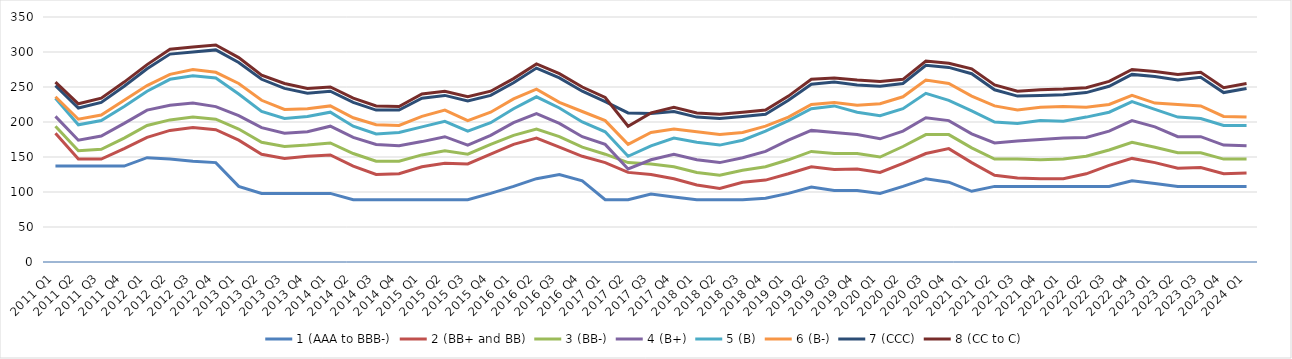
| Category | 1 (AAA to BBB-) | 2 (BB+ and BB) | 3 (BB-) | 4 (B+) | 5 (B) | 6 (B-) | 7 (CCC) | 8 (CC to C) |
|---|---|---|---|---|---|---|---|---|
| 2011 Q1 | 137 | 184 | 194 | 208 | 234 | 236 | 252 | 257 |
| 2011 Q2 | 137 | 147 | 159 | 174 | 196 | 204 | 220 | 226 |
| 2011 Q3 | 137 | 147 | 161 | 180 | 202 | 210 | 228 | 234 |
| 2011 Q4 | 137 | 162 | 177 | 198 | 222 | 231 | 251 | 257 |
| 2012 Q1 | 149 | 178 | 195 | 217 | 244 | 252 | 276 | 282 |
| 2012 Q2 | 147 | 188 | 203 | 224 | 261 | 268 | 297 | 304 |
| 2012 Q3 | 144 | 192 | 207 | 227 | 266 | 275 | 300 | 307 |
| 2012 Q4 | 142 | 189 | 204 | 222 | 263 | 271 | 303 | 310 |
| 2013 Q1 | 108 | 174 | 190 | 209 | 240 | 255 | 285 | 292 |
| 2013 Q2 | 98 | 154 | 171 | 192 | 215 | 231 | 261 | 267 |
| 2013 Q3 | 98 | 148 | 165 | 184 | 205 | 218 | 248 | 255 |
| 2013 Q4 | 98 | 151 | 167 | 186 | 208 | 219 | 241 | 248 |
| 2014 Q1 | 98 | 153 | 170 | 194 | 214 | 223 | 244 | 250 |
| 2014 Q2 | 89 | 137 | 155 | 178 | 194 | 206 | 228 | 234 |
| 2014 Q3 | 89 | 125 | 144 | 168 | 183 | 196 | 217 | 223 |
| 2014 Q4 | 89 | 126 | 144 | 166 | 185 | 195 | 217 | 222 |
| 2015 Q1 | 89 | 136 | 153 | 172 | 193 | 208 | 234 | 240 |
| 2015 Q2 | 89 | 141 | 159 | 179 | 201 | 217 | 238 | 244 |
| 2015 Q3 | 89 | 140 | 154 | 167 | 187 | 202 | 230 | 236 |
| 2015 Q4 | 98 | 154 | 168 | 181 | 199 | 214 | 238 | 244 |
| 2016 Q1 | 108 | 168 | 181 | 199 | 219 | 233 | 256 | 262 |
| 2016 Q2 | 119 | 177 | 190 | 212 | 236 | 247 | 277 | 283 |
| 2016 Q3 | 125 | 164 | 179 | 198 | 220 | 228 | 263 | 269 |
| 2016 Q4 | 116 | 151 | 164 | 179 | 200 | 215 | 244 | 250 |
| 2017 Q1 | 89 | 142 | 154 | 168 | 186 | 202 | 229 | 235 |
| 2017 Q2 | 89 | 128 | 142 | 133 | 151 | 168 | 213 | 194 |
| 2017 Q3 | 97 | 125 | 140 | 146 | 166 | 185 | 212 | 213 |
| 2017 Q4 | 93 | 119 | 136 | 154 | 177 | 190 | 215 | 221 |
| 2018 Q1 | 89 | 110 | 128 | 146 | 171 | 186 | 207 | 213 |
| 2018 Q2 | 89 | 105 | 124 | 142 | 167 | 182 | 205 | 211 |
| 2018 Q3 | 89 | 114 | 131 | 149 | 174 | 185 | 208 | 214 |
| 2018 Q4 | 91 | 117 | 136 | 158 | 187 | 194 | 211 | 217 |
| 2019 Q1 | 98 | 126 | 146 | 174 | 202 | 207 | 231 | 237 |
| 2019 Q2 | 107 | 136 | 158 | 188 | 219 | 225 | 254 | 261 |
| 2019 Q3 | 102 | 132 | 155 | 185 | 223 | 228 | 257 | 263 |
| 2019 Q4 | 102 | 133 | 155 | 182 | 214 | 224 | 253 | 260 |
| 2020 Q1 | 98 | 128 | 150 | 176 | 209 | 226 | 251 | 258 |
| 2020 Q2 | 108 | 141 | 165 | 187 | 219 | 236 | 255 | 261 |
| 2020 Q3 | 119 | 155 | 182 | 206 | 241 | 260 | 281 | 287 |
| 2020 Q4 | 114 | 162 | 182 | 202 | 231 | 255 | 278 | 284 |
| 2021 Q1 | 101 | 142 | 163 | 183 | 216 | 237 | 269 | 276 |
| 2021 Q2 | 108 | 124 | 147 | 170 | 200 | 223 | 246 | 253 |
| 2021 Q3 | 108 | 120 | 147 | 173 | 198 | 217 | 237 | 244 |
| 2021 Q4 | 108 | 119 | 146 | 175 | 202 | 221 | 238 | 246 |
| 2022 Q1 | 108 | 119 | 147 | 177 | 201 | 222 | 239 | 247 |
| 2022 Q2 | 108 | 126 | 151 | 178 | 207 | 221 | 242 | 249 |
| 2022 Q3 | 108 | 138 | 160 | 187 | 214 | 225 | 251 | 258 |
| 2022 Q4 | 116 | 148 | 171 | 202 | 229 | 238 | 268 | 275 |
| 2023 Q1 | 112 | 142 | 164 | 193 | 218 | 227 | 265 | 272 |
| 2023 Q2 | 108 | 134 | 156 | 179 | 207 | 225 | 260 | 268 |
| 2023 Q3 | 108 | 135 | 156 | 179 | 205 | 223 | 264 | 271 |
| 2023 Q4 | 108 | 126 | 147 | 167 | 195 | 208 | 242 | 249 |
| 2024 Q1 | 108 | 127 | 147 | 166 | 195 | 207 | 248 | 255 |